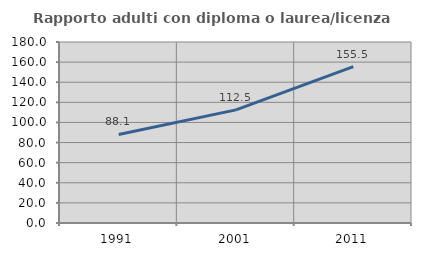
| Category | Rapporto adulti con diploma o laurea/licenza media  |
|---|---|
| 1991.0 | 88.094 |
| 2001.0 | 112.517 |
| 2011.0 | 155.5 |